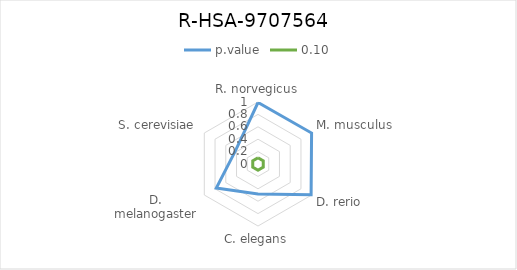
| Category | p.value | 0.10 |
|---|---|---|
| R. norvegicus | 0.992 | 0.1 |
| M. musculus | 0.998 | 0.1 |
| D. rerio | 0.989 | 0.1 |
| C. elegans | 0.485 | 0.1 |
| D. melanogaster | 0.776 | 0.1 |
| S. cerevisiae | 0.421 | 0.1 |